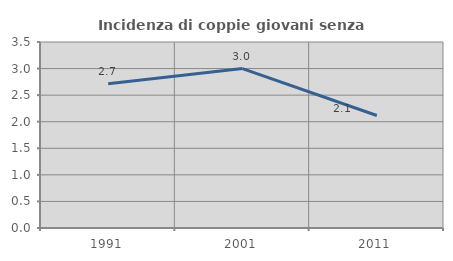
| Category | Incidenza di coppie giovani senza figli |
|---|---|
| 1991.0 | 2.716 |
| 2001.0 | 2.999 |
| 2011.0 | 2.116 |